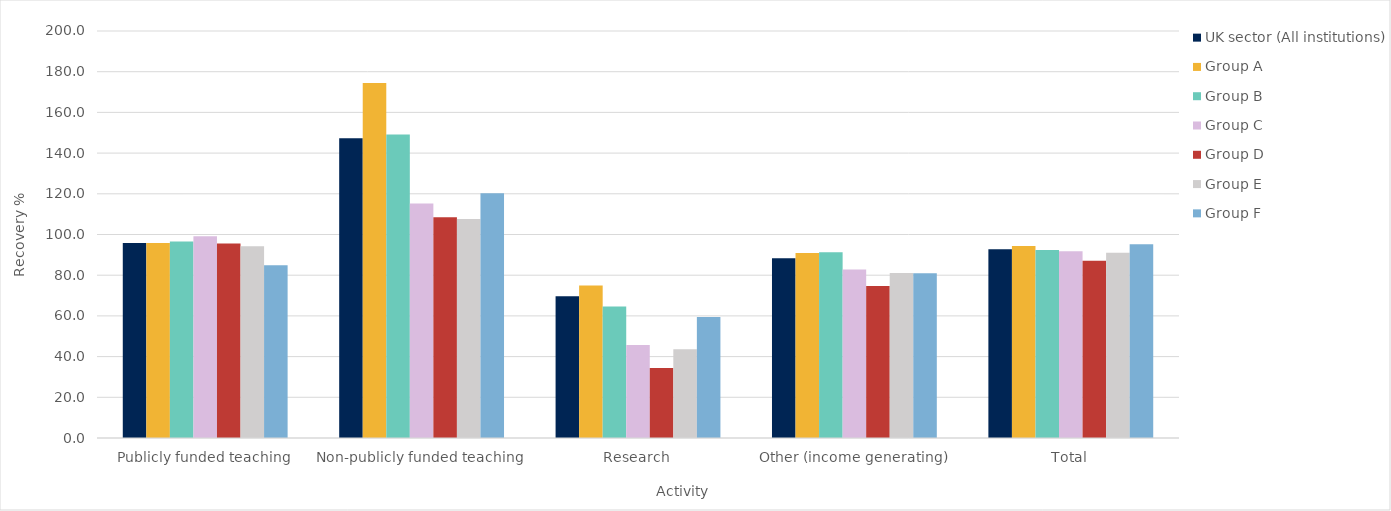
| Category | UK sector (All institutions) | Group A | Group B | Group C | Group D | Group E | Group F |
|---|---|---|---|---|---|---|---|
| 0 | 95.799 | 95.778 | 96.587 | 99.17 | 95.595 | 94.238 | 84.91 |
| 1 | 147.302 | 174.402 | 149.119 | 115.174 | 108.519 | 107.678 | 120.291 |
| 2 | 69.715 | 74.886 | 64.635 | 45.742 | 34.359 | 43.584 | 59.489 |
| 3 | 88.309 | 90.876 | 91.292 | 82.782 | 74.734 | 81.122 | 80.93 |
| 4 | 92.802 | 94.39 | 92.412 | 91.72 | 87.145 | 90.976 | 95.214 |